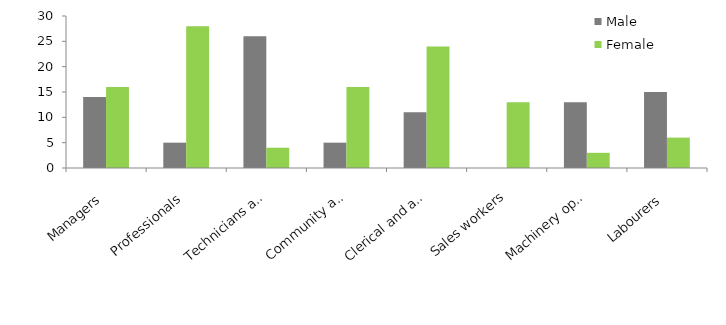
| Category | Male | Female |
|---|---|---|
| Managers | 14 | 16 |
| Professionals | 5 | 28 |
| Technicians and trades workers | 26 | 4 |
| Community and personal service workers | 5 | 16 |
| Clerical and administrative workers | 11 | 24 |
| Sales workers | 0 | 13 |
| Machinery operators and drivers | 13 | 3 |
| Labourers | 15 | 6 |